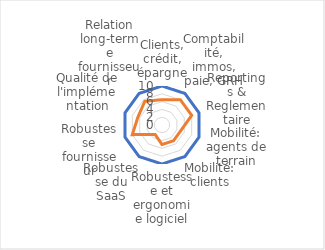
| Category | Ideal | Fournisseur #2 |
|---|---|---|
| Clients, crédit, épargne | 10 | 6.5 |
| Comptabilité, immos, paie, GRH | 10 | 8 |
| Reportings & Reglementaire | 10 | 8 |
| Mobilité: agents de terrain | 10 | 5 |
| Mobilité: clients | 10 | 5 |
| Robustesse et ergonomie logiciel | 10 | 5 |
| Robustesse du SaaS | 10 | 3 |
| Robustesse fournisseur | 10 | 8 |
| Qualité de l'implémentation | 10 | 6.5 |
| Relation long-terme fournisseur | 10 | 7.5 |